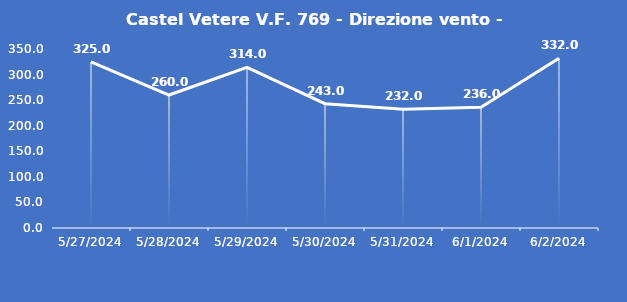
| Category | Castel Vetere V.F. 769 - Direzione vento - Grezzo (°N) |
|---|---|
| 5/27/24 | 325 |
| 5/28/24 | 260 |
| 5/29/24 | 314 |
| 5/30/24 | 243 |
| 5/31/24 | 232 |
| 6/1/24 | 236 |
| 6/2/24 | 332 |